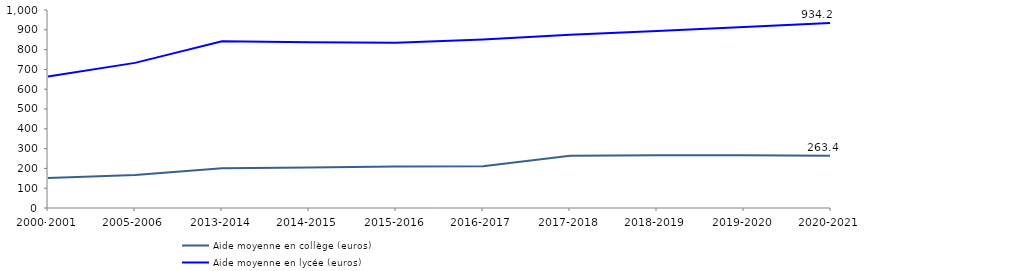
| Category | Aide moyenne en collège (euros) | Aide moyenne en lycée (euros) |
|---|---|---|
| 2000-2001 | 152.1 | 664 |
| 2005-2006 | 167.04 | 733 |
| 2013-2014 | 200.91 | 842.312 |
| 2014-2015 | 204.77 | 837.671 |
| 2015-2016 | 209.984 | 834.06 |
| 2016-2017 | 210.782 | 850.906 |
| 2017-2018 | 264.156 | 874.61 |
| 2018-2019 | 265.969 | 893.744 |
| 2019-2020 | 266.8 | 914 |
| 2020-2021 | 263.4 | 934.2 |